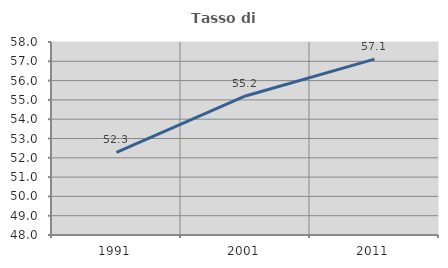
| Category | Tasso di occupazione   |
|---|---|
| 1991.0 | 52.281 |
| 2001.0 | 55.204 |
| 2011.0 | 57.112 |